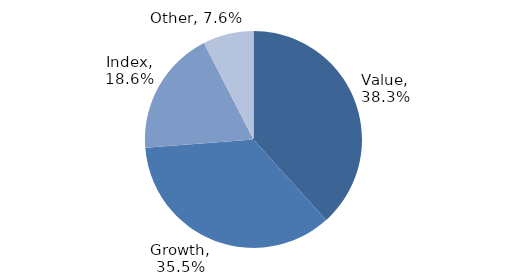
| Category | Investment Style |
|---|---|
| Value | 0.383 |
| Growth | 0.355 |
| Index | 0.186 |
| Other | 0.076 |